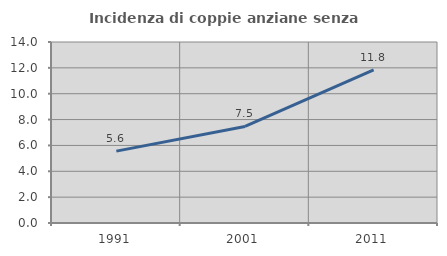
| Category | Incidenza di coppie anziane senza figli  |
|---|---|
| 1991.0 | 5.559 |
| 2001.0 | 7.467 |
| 2011.0 | 11.842 |